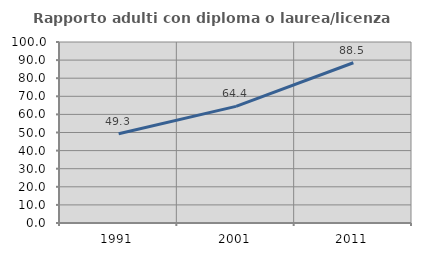
| Category | Rapporto adulti con diploma o laurea/licenza media  |
|---|---|
| 1991.0 | 49.324 |
| 2001.0 | 64.431 |
| 2011.0 | 88.52 |